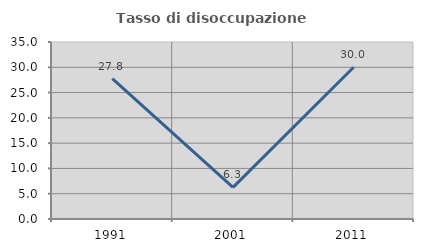
| Category | Tasso di disoccupazione giovanile  |
|---|---|
| 1991.0 | 27.778 |
| 2001.0 | 6.25 |
| 2011.0 | 30 |